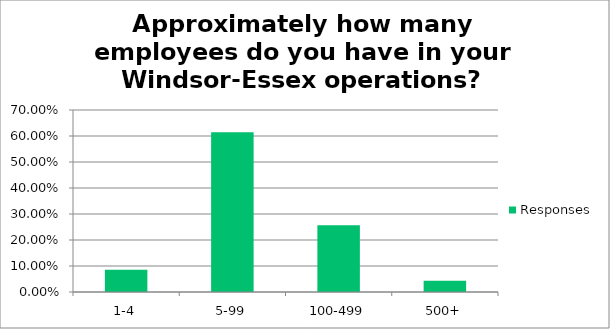
| Category | Responses |
|---|---|
| 1-4 | 0.086 |
| 5-99 | 0.614 |
| 100-499 | 0.257 |
| 500+ | 0.043 |